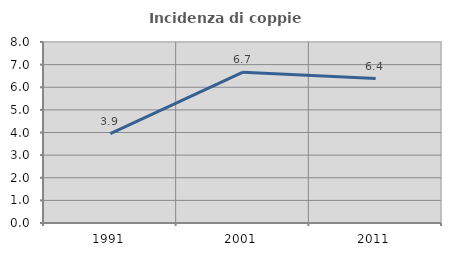
| Category | Incidenza di coppie miste |
|---|---|
| 1991.0 | 3.947 |
| 2001.0 | 6.667 |
| 2011.0 | 6.383 |